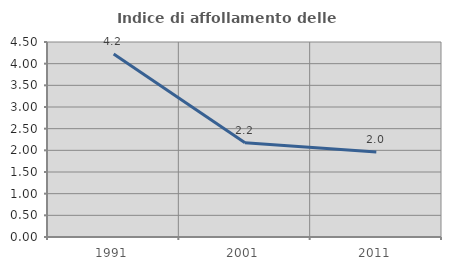
| Category | Indice di affollamento delle abitazioni  |
|---|---|
| 1991.0 | 4.221 |
| 2001.0 | 2.173 |
| 2011.0 | 1.963 |